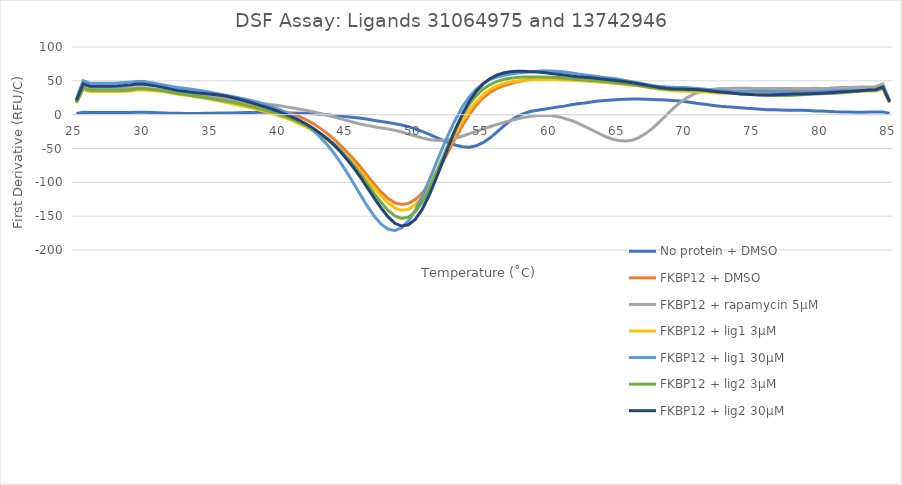
| Category | No protein + DMSO | FKBP12 + DMSO | FKBP12 + rapamycin 5µM | FKBP12 + lig1 3µM | FKBP12 + lig1 30µM | FKBP12 + lig2 3µM | FKBP12 + lig2 30µM |
|---|---|---|---|---|---|---|---|
| 25.0 | 1.662 | 18.797 | 19.254 | 17.077 | 23.174 | 17.959 | 21.001 |
| 25.5 | 3.601 | 40.727 | 41.717 | 37 | 50.211 | 38.911 | 45.502 |
| 26.0 | 3.324 | 37.594 | 38.508 | 34.154 | 46.349 | 35.917 | 42.002 |
| 26.5 | 3.324 | 37.594 | 38.508 | 34.154 | 46.349 | 35.917 | 42.002 |
| 27.0 | 3.324 | 37.594 | 38.508 | 34.154 | 46.349 | 35.917 | 42.002 |
| 27.5 | 3.334 | 37.591 | 38.491 | 34.14 | 46.285 | 35.905 | 41.94 |
| 28.0 | 3.282 | 37.599 | 38.594 | 34.203 | 46.685 | 35.963 | 42.323 |
| 28.5 | 3.063 | 37.705 | 38.799 | 34.443 | 47.41 | 36.16 | 43.009 |
| 29.0 | 3.117 | 38.053 | 39.233 | 35.132 | 48.058 | 36.963 | 43.924 |
| 29.5 | 3.569 | 39.157 | 39.894 | 36.332 | 49.15 | 38.254 | 45.227 |
| 30.0 | 3.59 | 39.229 | 39.253 | 36.645 | 48.98 | 38.352 | 45.037 |
| 30.5 | 3.128 | 37.986 | 37.834 | 35.773 | 47.29 | 37.441 | 43.432 |
| 31.0 | 2.868 | 36.8 | 36.779 | 34.917 | 45.499 | 36.435 | 41.83 |
| 31.5 | 2.575 | 35.178 | 35.678 | 33.809 | 43.609 | 34.939 | 39.981 |
| 32.0 | 2.106 | 33.069 | 34.636 | 31.874 | 41.578 | 32.951 | 37.728 |
| 32.5 | 1.913 | 31.619 | 34.175 | 30.078 | 40.087 | 31.257 | 35.821 |
| 33.0 | 1.849 | 30.765 | 33.647 | 28.926 | 38.959 | 29.885 | 34.482 |
| 33.5 | 1.748 | 29.905 | 32.414 | 27.459 | 37.537 | 28.405 | 33.246 |
| 34.0 | 1.883 | 29.338 | 30.935 | 25.669 | 36.054 | 26.8 | 32.141 |
| 34.5 | 2.077 | 28.65 | 28.992 | 24.1 | 34.575 | 25.229 | 31.174 |
| 35.0 | 2.154 | 27.652 | 26.68 | 22.448 | 32.695 | 23.669 | 30.255 |
| 35.5 | 2.415 | 26.409 | 24.711 | 20.445 | 30.614 | 21.877 | 29.124 |
| 36.0 | 2.62 | 24.762 | 23.144 | 18.342 | 28.801 | 20.117 | 27.55 |
| 36.5 | 2.628 | 22.667 | 21.582 | 16.182 | 26.94 | 18.478 | 25.399 |
| 37.0 | 2.829 | 20.598 | 20.206 | 13.973 | 24.912 | 16.491 | 22.801 |
| 37.5 | 3.2 | 18.346 | 19.302 | 11.78 | 22.682 | 14.087 | 20.106 |
| 38.0 | 3.326 | 15.894 | 18.286 | 9.452 | 20.42 | 11.701 | 17.25 |
| 38.5 | 3.4 | 13.502 | 17.013 | 7.001 | 17.884 | 9.086 | 14.104 |
| 39.0 | 3.406 | 11.154 | 15.899 | 4.388 | 14.854 | 6.189 | 10.916 |
| 39.5 | 3.144 | 8.722 | 14.664 | 1.322 | 11.218 | 3.313 | 7.646 |
| 40.0 | 2.728 | 6.19 | 13.101 | -2.061 | 7.42 | 0.283 | 4.032 |
| 40.5 | 2.516 | 3.518 | 11.502 | -5.547 | 3.072 | -3.16 | 0.026 |
| 41.0 | 2.43 | 0.372 | 9.971 | -9.55 | -2.317 | -7.145 | -4.285 |
| 41.5 | 2.244 | -3.379 | 8.097 | -13.993 | -8.419 | -11.61 | -8.971 |
| 42.0 | 1.885 | -7.959 | 6.068 | -18.592 | -15.433 | -16.556 | -14.259 |
| 42.5 | 1.425 | -13.532 | 3.934 | -23.928 | -23.771 | -21.911 | -20.439 |
| 43.0 | 0.767 | -20.235 | 1.642 | -30.249 | -33.479 | -28.086 | -27.585 |
| 43.5 | -0.146 | -27.747 | -0.782 | -36.979 | -44.303 | -35.128 | -35.545 |
| 44.0 | -1.11 | -36.175 | -3.506 | -44.572 | -56.857 | -43.17 | -44.723 |
| 44.5 | -1.992 | -45.704 | -6.187 | -53.511 | -71.133 | -52.753 | -55.28 |
| 45.0 | -3.004 | -55.928 | -8.835 | -63.176 | -86.625 | -63.857 | -67.036 |
| 45.5 | -4.214 | -66.719 | -11.574 | -73.468 | -102.977 | -75.909 | -79.751 |
| 46.0 | -5.453 | -78.553 | -14.09 | -84.863 | -119.861 | -88.992 | -93.809 |
| 46.5 | -6.876 | -91.124 | -16.013 | -96.921 | -136.23 | -103.063 | -108.934 |
| 47.0 | -8.478 | -103.31 | -17.797 | -108.903 | -150.623 | -117.027 | -124.085 |
| 47.5 | -9.978 | -114.537 | -19.603 | -120.361 | -161.943 | -130.111 | -138.366 |
| 48.0 | -11.448 | -123.973 | -21.252 | -130.511 | -169.247 | -141.567 | -151.114 |
| 48.5 | -13.296 | -130.362 | -23.239 | -138.004 | -171.334 | -149.779 | -160.56 |
| 49.0 | -15.338 | -132.807 | -25.686 | -141.368 | -167.093 | -153.356 | -164.566 |
| 49.5 | -17.751 | -131.126 | -28.508 | -139.958 | -156.867 | -151.328 | -162.703 |
| 50.0 | -20.901 | -125.567 | -31.476 | -133.532 | -141.475 | -143.23 | -154.801 |
| 50.5 | -24.759 | -116.378 | -34.35 | -121.941 | -121.551 | -129.568 | -140.415 |
| 51.0 | -28.848 | -103.609 | -36.641 | -105.843 | -98.509 | -110.992 | -120.26 |
| 51.5 | -33.174 | -88.113 | -37.99 | -86.852 | -74.084 | -88.718 | -96.579 |
| 52.0 | -37.725 | -70.948 | -38.021 | -66.38 | -49.743 | -65.059 | -70.855 |
| 52.5 | -41.908 | -52.434 | -36.708 | -45.676 | -26.783 | -41.746 | -44.715 |
| 53.0 | -45.225 | -33.595 | -34.48 | -26.09 | -5.997 | -19.606 | -20.152 |
| 53.5 | -47.475 | -15.741 | -31.5 | -8.533 | 12.066 | -0.29 | 1.571 |
| 54.0 | -48.058 | 0.348 | -28.102 | 6.638 | 26.552 | 15.488 | 19.824 |
| 54.5 | -46.037 | 13.993 | -24.696 | 19.254 | 37.605 | 28.005 | 34.176 |
| 55.0 | -41.397 | 24.666 | -21.267 | 29.212 | 46.011 | 37.541 | 45.144 |
| 55.5 | -34.588 | 32.671 | -17.797 | 36.824 | 51.817 | 44.287 | 53.211 |
| 56.0 | -26.128 | 38.423 | -14.664 | 42.298 | 55.416 | 48.91 | 58.396 |
| 56.5 | -17.176 | 42.448 | -11.678 | 45.828 | 57.865 | 51.972 | 61.493 |
| 57.0 | -9.167 | 45.649 | -8.774 | 48.154 | 59.827 | 53.908 | 63.347 |
| 57.5 | -3 | 48.383 | -6.459 | 49.862 | 61.299 | 54.982 | 64.06 |
| 58.0 | 1.553 | 50.6 | -4.401 | 50.873 | 62.433 | 55.582 | 63.999 |
| 58.5 | 4.584 | 52.324 | -2.477 | 51.431 | 63.414 | 55.826 | 63.603 |
| 59.0 | 6.386 | 53.786 | -1.405 | 51.966 | 64.336 | 55.794 | 63.001 |
| 59.5 | 7.898 | 54.632 | -1.148 | 52.194 | 64.867 | 55.663 | 62.186 |
| 60.0 | 9.682 | 54.865 | -1.387 | 51.954 | 64.608 | 55.265 | 60.997 |
| 60.5 | 11.173 | 54.905 | -2.839 | 51.662 | 63.95 | 54.515 | 59.677 |
| 61.0 | 12.644 | 54.744 | -5.452 | 51.368 | 63.163 | 53.738 | 58.534 |
| 61.5 | 14.584 | 54.093 | -8.495 | 50.947 | 61.813 | 52.872 | 57.313 |
| 62.0 | 16.144 | 53.424 | -12.462 | 50.423 | 60.044 | 51.912 | 56.066 |
| 62.5 | 17.333 | 53.051 | -17.321 | 49.793 | 58.709 | 51.235 | 55.182 |
| 63.0 | 18.809 | 52.665 | -22.254 | 49.075 | 57.659 | 50.576 | 54.392 |
| 63.5 | 20.062 | 52.05 | -27.122 | 48.249 | 56.204 | 49.691 | 53.388 |
| 64.0 | 20.805 | 51.564 | -32.087 | 47.362 | 54.818 | 48.895 | 52.227 |
| 64.5 | 21.743 | 50.974 | -35.977 | 46.451 | 53.808 | 48.081 | 51.123 |
| 65.0 | 22.471 | 49.682 | -38.28 | 45.601 | 52.47 | 46.931 | 50.016 |
| 65.5 | 22.788 | 48.01 | -39.064 | 44.668 | 50.535 | 45.686 | 48.616 |
| 66.0 | 23.047 | 46.611 | -37.765 | 43.644 | 48.676 | 44.612 | 47.086 |
| 66.5 | 23.04 | 44.994 | -33.945 | 42.324 | 46.929 | 43.213 | 45.64 |
| 67.0 | 22.713 | 43.011 | -27.968 | 40.736 | 44.837 | 41.424 | 43.912 |
| 67.5 | 22.533 | 41.604 | -20.244 | 39.166 | 42.898 | 39.834 | 41.946 |
| 68.0 | 22.157 | 40.503 | -11.02 | 37.599 | 41.682 | 38.608 | 40.28 |
| 68.5 | 21.567 | 39.168 | -1.165 | 36.271 | 41.005 | 37.531 | 39.032 |
| 69.0 | 20.975 | 38.175 | 8.515 | 35.356 | 40.435 | 36.81 | 38.204 |
| 69.5 | 20.151 | 37.74 | 17.199 | 34.938 | 40.14 | 36.75 | 37.825 |
| 70.0 | 19.045 | 37.09 | 24.437 | 34.622 | 39.931 | 36.692 | 37.57 |
| 70.5 | 17.731 | 36.344 | 29.975 | 34.282 | 39.307 | 36.303 | 37.21 |
| 71.0 | 16.248 | 35.761 | 33.846 | 33.848 | 38.363 | 35.802 | 36.68 |
| 71.5 | 14.895 | 35.07 | 36.257 | 33.324 | 37.373 | 35.257 | 35.801 |
| 72.0 | 13.669 | 34.433 | 37.745 | 32.565 | 36.318 | 34.286 | 34.634 |
| 72.5 | 12.398 | 33.895 | 38.574 | 31.861 | 35.4 | 33.166 | 33.567 |
| 73.0 | 11.603 | 33.533 | 38.837 | 31.507 | 34.88 | 32.324 | 32.598 |
| 73.5 | 11.064 | 33.462 | 38.898 | 31.139 | 34.642 | 31.626 | 31.515 |
| 74.0 | 10.191 | 33.455 | 39.021 | 30.79 | 34.474 | 30.825 | 30.621 |
| 74.5 | 9.42 | 33.282 | 38.995 | 30.723 | 34.466 | 30.148 | 30.015 |
| 75.0 | 8.904 | 33.277 | 38.834 | 30.688 | 34.628 | 29.767 | 29.445 |
| 75.5 | 8.051 | 33.297 | 38.826 | 30.3 | 34.672 | 29.248 | 29.128 |
| 76.0 | 7.305 | 33.182 | 38.849 | 30.068 | 34.386 | 28.604 | 29.194 |
| 76.5 | 7.12 | 33.456 | 38.71 | 30.114 | 34.097 | 28.278 | 29.411 |
| 77.0 | 6.884 | 34.054 | 38.589 | 30.003 | 34.111 | 28.32 | 29.738 |
| 77.5 | 6.534 | 34.534 | 38.73 | 29.883 | 33.869 | 28.504 | 30.109 |
| 78.0 | 6.482 | 35.042 | 38.763 | 30.223 | 33.497 | 28.877 | 30.366 |
| 78.5 | 6.409 | 35.608 | 38.687 | 30.607 | 33.655 | 29.407 | 30.667 |
| 79.0 | 5.979 | 35.721 | 38.76 | 30.791 | 34.189 | 30.015 | 30.975 |
| 79.5 | 5.538 | 35.548 | 38.9 | 31.141 | 34.331 | 30.522 | 31.256 |
| 80.0 | 5.244 | 35.607 | 38.829 | 31.777 | 34.62 | 30.767 | 31.74 |
| 80.5 | 4.818 | 35.757 | 39.11 | 32.301 | 35.342 | 31.178 | 32.406 |
| 81.0 | 4.272 | 35.649 | 39.663 | 32.711 | 35.754 | 31.764 | 33.06 |
| 81.5 | 4.012 | 35.737 | 39.966 | 33.277 | 35.788 | 32.379 | 33.742 |
| 82.0 | 3.919 | 35.994 | 40.206 | 33.924 | 36.052 | 33.126 | 34.42 |
| 82.5 | 3.741 | 36.044 | 40.672 | 34.213 | 36.415 | 34.123 | 35.118 |
| 83.0 | 3.729 | 36.036 | 40.825 | 34.466 | 36.445 | 35.224 | 35.73 |
| 83.5 | 3.823 | 36.15 | 40.94 | 34.926 | 36.771 | 35.912 | 36.466 |
| 84.0 | 3.824 | 36.23 | 41.231 | 35.003 | 37.052 | 36.415 | 36.943 |
| 84.5 | 4.086 | 39.157 | 45.235 | 38.182 | 40.816 | 39.484 | 40.961 |
| 85.0 | 1.883 | 18.035 | 21.156 | 17.77 | 19.151 | 18.099 | 19.312 |